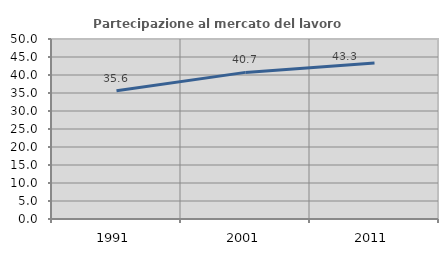
| Category | Partecipazione al mercato del lavoro  femminile |
|---|---|
| 1991.0 | 35.642 |
| 2001.0 | 40.728 |
| 2011.0 | 43.312 |